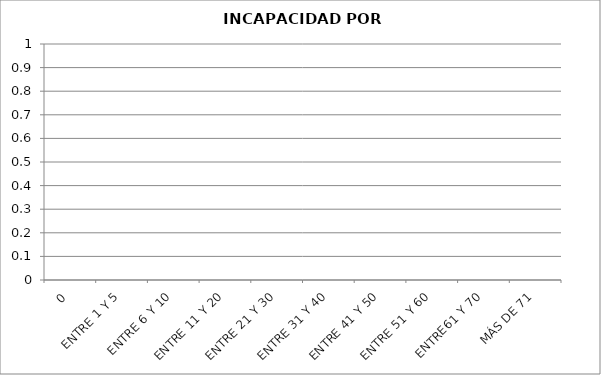
| Category | CANTIDAD |
|---|---|
| 0 | 0 |
| ENTRE 1 Y 5 | 0 |
| ENTRE 6 Y 10 | 0 |
| ENTRE 11 Y 20 | 0 |
| ENTRE 21 Y 30 | 0 |
| ENTRE 31 Y 40 | 0 |
| ENTRE 41 Y 50 | 0 |
| ENTRE 51 Y 60 | 0 |
| ENTRE61 Y 70 | 0 |
| MÁS DE 71 | 0 |